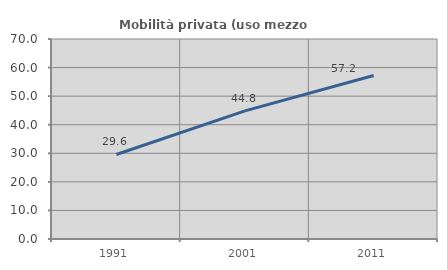
| Category | Mobilità privata (uso mezzo privato) |
|---|---|
| 1991.0 | 29.577 |
| 2001.0 | 44.83 |
| 2011.0 | 57.228 |